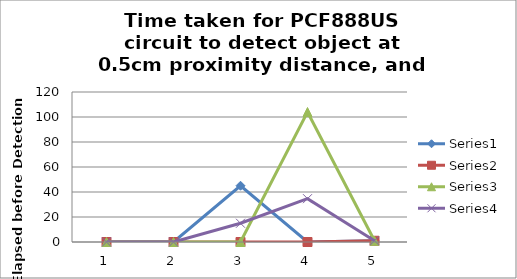
| Category | Series 0 | Series 1 | Series 2 | Series 3 |
|---|---|---|---|---|
| 0 | 0 | 0 | 0 | 0 |
| 1 | 0 | 0 | 0 | 0 |
| 2 | 45 | 0 | 0 | 15 |
| 3 | 0 | 0 | 104 | 34.667 |
| 4 | 1 | 1 | 1 | 1 |